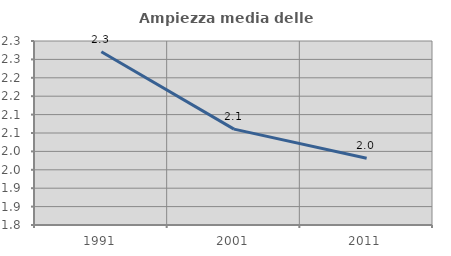
| Category | Ampiezza media delle famiglie |
|---|---|
| 1991.0 | 2.271 |
| 2001.0 | 2.061 |
| 2011.0 | 1.982 |